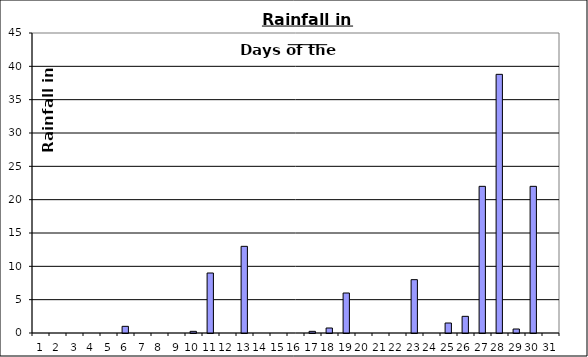
| Category | Series 0 |
|---|---|
| 0 | 0 |
| 1 | 0 |
| 2 | 0 |
| 3 | 0 |
| 4 | 0 |
| 5 | 1 |
| 6 | 0 |
| 7 | 0 |
| 8 | 0 |
| 9 | 0.25 |
| 10 | 9 |
| 11 | 0 |
| 12 | 13 |
| 13 | 0 |
| 14 | 0 |
| 15 | 0 |
| 16 | 0.25 |
| 17 | 0.75 |
| 18 | 6 |
| 19 | 0 |
| 20 | 0 |
| 21 | 0 |
| 22 | 8 |
| 23 | 0 |
| 24 | 1.5 |
| 25 | 2.5 |
| 26 | 22 |
| 27 | 38.8 |
| 28 | 0.6 |
| 29 | 22 |
| 30 | 0 |